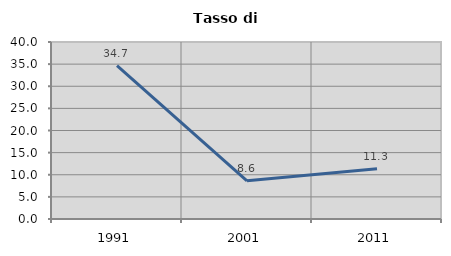
| Category | Tasso di disoccupazione   |
|---|---|
| 1991.0 | 34.677 |
| 2001.0 | 8.636 |
| 2011.0 | 11.34 |